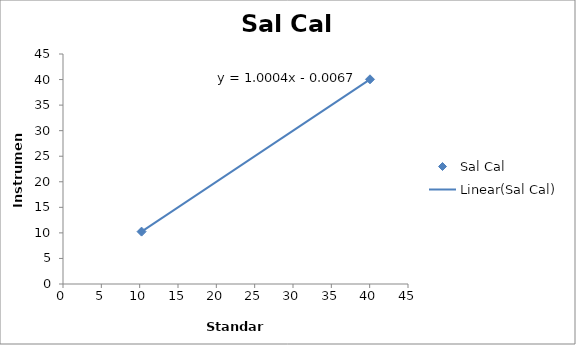
| Category | Sal Cal |
|---|---|
| 40.04233333333334 | 40.05 |
| 10.251 | 10.248 |